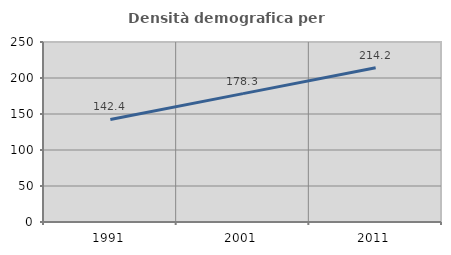
| Category | Densità demografica |
|---|---|
| 1991.0 | 142.437 |
| 2001.0 | 178.329 |
| 2011.0 | 214.162 |